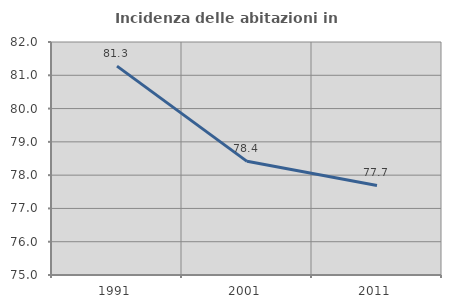
| Category | Incidenza delle abitazioni in proprietà  |
|---|---|
| 1991.0 | 81.276 |
| 2001.0 | 78.414 |
| 2011.0 | 77.689 |